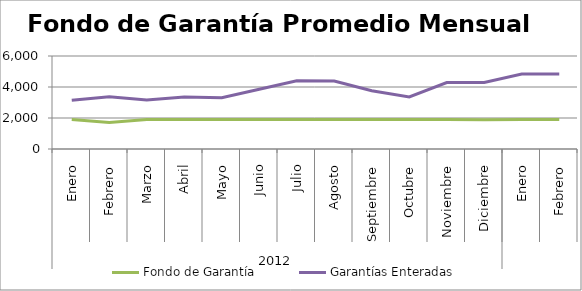
| Category | Fondo de Garantía | Garantías Enteradas |
|---|---|---|
| 0 | 1896.798 | 3141.641 |
| 1 | 1714.423 | 3362.648 |
| 2 | 1900.513 | 3154.118 |
| 3 | 1900.513 | 3348.058 |
| 4 | 1898.685 | 3308.859 |
| 5 | 1900.513 | 3850.375 |
| 6 | 1900.513 | 4400.539 |
| 7 | 1895.388 | 4383.327 |
| 8 | 1900.513 | 3757.632 |
| 9 | 1900.513 | 3362.932 |
| 10 | 1900.311 | 4285.609 |
| 11 | 1890.98 | 4296.87 |
| 12 | 1898.667 | 4842.786 |
| 13 | 1900.512 | 4845.136 |